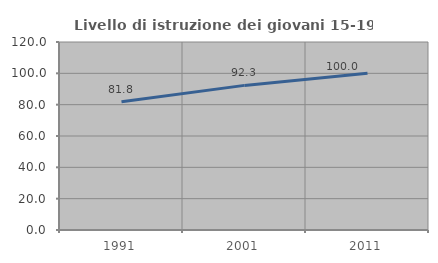
| Category | Livello di istruzione dei giovani 15-19 anni |
|---|---|
| 1991.0 | 81.818 |
| 2001.0 | 92.308 |
| 2011.0 | 100 |